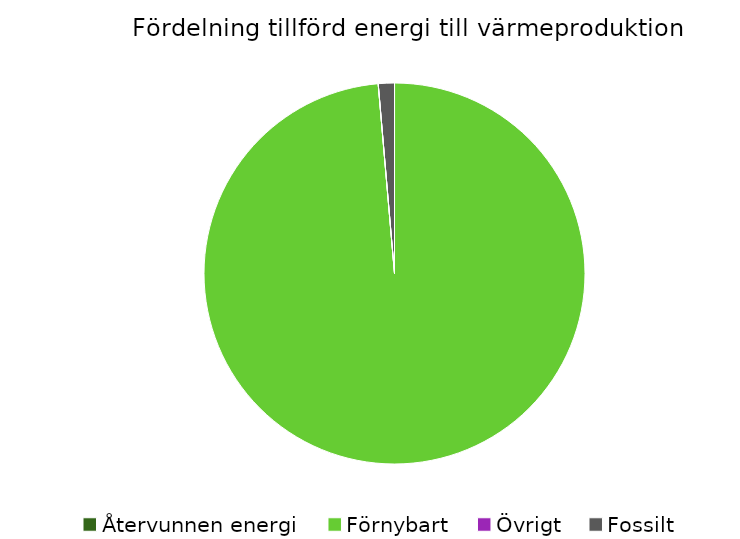
| Category | Fördelning värmeproduktion |
|---|---|
| Återvunnen energi | 0 |
| Förnybart | 0.986 |
| Övrigt | 0 |
| Fossilt | 0.014 |